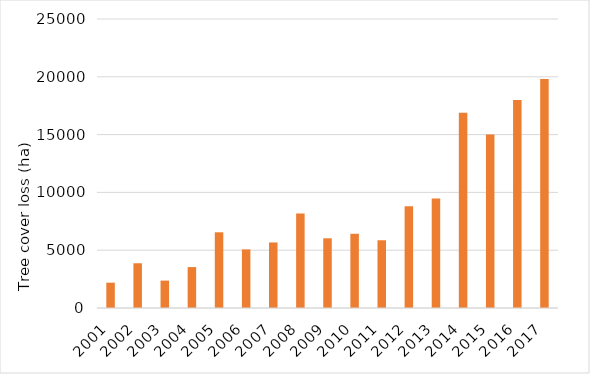
| Category | Tree cover loss (ha) |
|---|---|
| 2001.0 | 2190 |
| 2002.0 | 3870 |
| 2003.0 | 2370 |
| 2004.0 | 3540 |
| 2005.0 | 6550 |
| 2006.0 | 5070 |
| 2007.0 | 5670 |
| 2008.0 | 8170 |
| 2009.0 | 6030 |
| 2010.0 | 6420 |
| 2011.0 | 5860 |
| 2012.0 | 8810 |
| 2013.0 | 9470 |
| 2014.0 | 16900 |
| 2015.0 | 15000 |
| 2016.0 | 18000 |
| 2017.0 | 19800 |